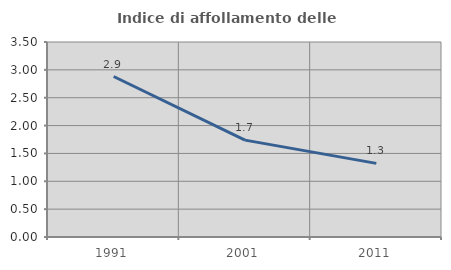
| Category | Indice di affollamento delle abitazioni  |
|---|---|
| 1991.0 | 2.881 |
| 2001.0 | 1.739 |
| 2011.0 | 1.322 |